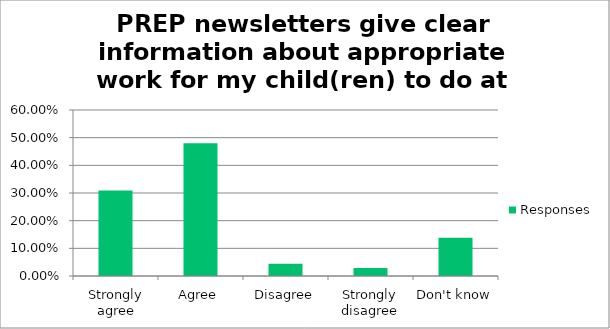
| Category | Responses |
|---|---|
| Strongly agree | 0.309 |
| Agree | 0.48 |
| Disagree | 0.045 |
| Strongly disagree | 0.028 |
| Don't know | 0.138 |